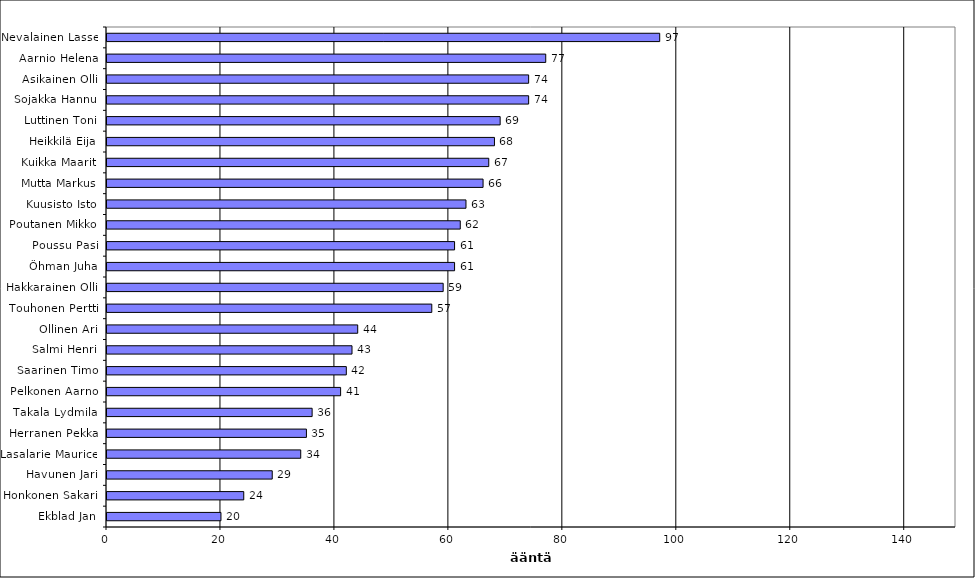
| Category | Series 0 |
|---|---|
| Nevalainen Lasse | 97 |
| Aarnio Helena | 77 |
| Asikainen Olli | 74 |
| Sojakka Hannu | 74 |
| Luttinen Toni | 69 |
| Heikkilä Eija | 68 |
| Kuikka Maarit | 67 |
| Mutta Markus | 66 |
| Kuusisto Isto | 63 |
| Poutanen Mikko | 62 |
| Poussu Pasi | 61 |
| Öhman Juha | 61 |
| Hakkarainen Olli | 59 |
| Touhonen Pertti | 57 |
| Ollinen Ari | 44 |
| Salmi Henri | 43 |
| Saarinen Timo | 42 |
| Pelkonen Aarno | 41 |
| Takala Lydmila | 36 |
| Herranen Pekka | 35 |
| Lasalarie Maurice | 34 |
| Havunen Jari | 29 |
| Honkonen Sakari | 24 |
| Ekblad Jan | 20 |